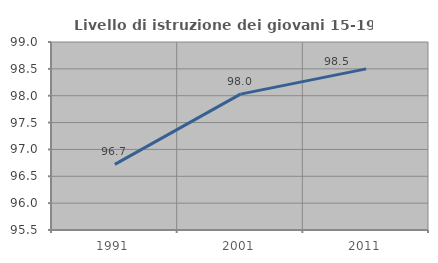
| Category | Livello di istruzione dei giovani 15-19 anni |
|---|---|
| 1991.0 | 96.721 |
| 2001.0 | 98.03 |
| 2011.0 | 98.5 |